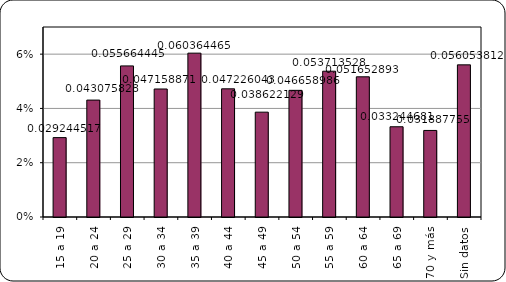
| Category | Series 1 |
|---|---|
| 15 a 19 | 0.029 |
| 20 a 24 | 0.043 |
| 25 a 29 | 0.056 |
| 30 a 34 | 0.047 |
| 35 a 39 | 0.06 |
| 40 a 44 | 0.047 |
| 45 a 49 | 0.039 |
| 50 a 54 | 0.047 |
| 55 a 59 | 0.054 |
| 60 a 64 | 0.052 |
| 65 a 69 | 0.033 |
| 70 y más | 0.032 |
| Sin datos | 0.056 |